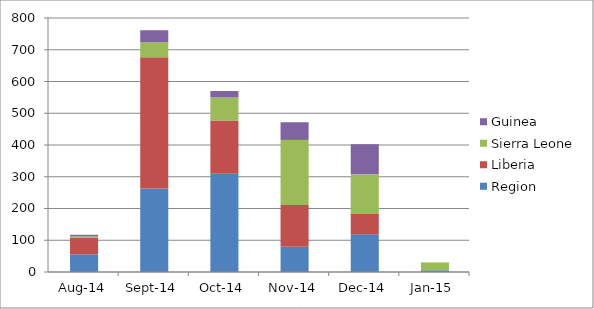
| Category | Region | Liberia | Sierra Leone | Guinea  |
|---|---|---|---|---|
| 2014-08-31 | 55.763 | 51.638 | 4.928 | 4.918 |
| 2014-09-30 | 263.042 | 413.329 | 46.906 | 38.095 |
| 2014-10-31 | 309.83 | 167.384 | 72.481 | 20.479 |
| 2014-11-30 | 79.442 | 131.67 | 204.851 | 55.693 |
| 2014-12-31 | 118.515 | 64.448 | 124.498 | 95.088 |
| 2015-01-31 | 5.453 | 0 | 24.644 | 0 |